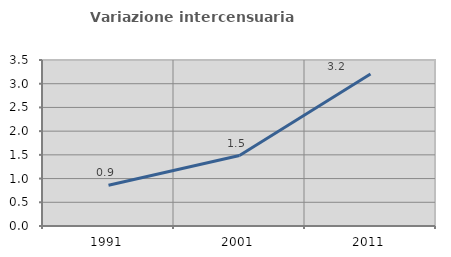
| Category | Variazione intercensuaria annua |
|---|---|
| 1991.0 | 0.859 |
| 2001.0 | 1.486 |
| 2011.0 | 3.206 |